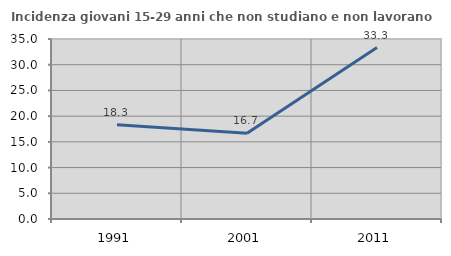
| Category | Incidenza giovani 15-29 anni che non studiano e non lavorano  |
|---|---|
| 1991.0 | 18.333 |
| 2001.0 | 16.667 |
| 2011.0 | 33.333 |